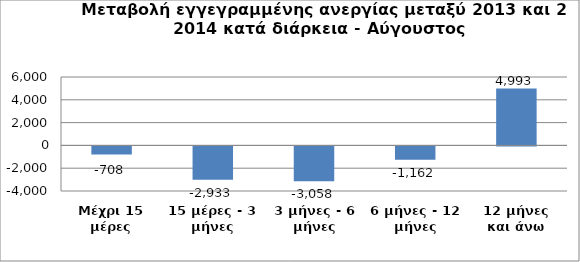
| Category | Series 0 |
|---|---|
| Μέχρι 15 μέρες | -708 |
| 15 μέρες - 3 μήνες | -2933 |
| 3 μήνες - 6 μήνες | -3058 |
| 6 μήνες - 12 μήνες | -1162 |
| 12 μήνες και άνω | 4993 |